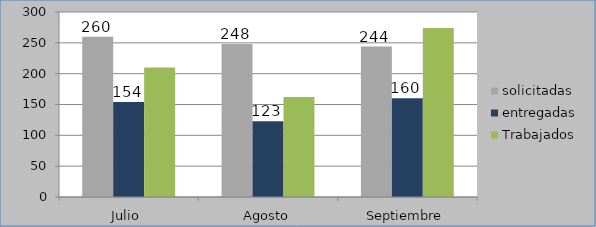
| Category | solicitadas | entregadas | Trabajados |
|---|---|---|---|
| Julio  | 260 | 154 | 210 |
| Agosto | 248 | 123 | 162 |
| Septiembre | 244 | 160 | 274 |